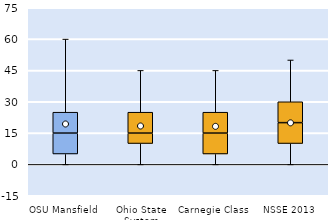
| Category | 25th | 50th | 75th |
|---|---|---|---|
| OSU Mansfield | 5 | 10 | 10 |
| Ohio State System | 10 | 5 | 10 |
| Carnegie Class | 5 | 10 | 10 |
| NSSE 2013 | 10 | 10 | 10 |